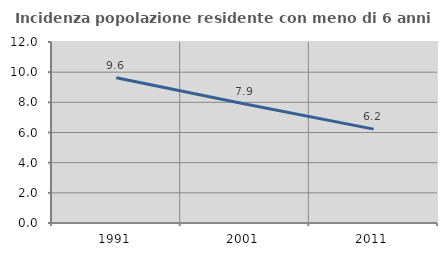
| Category | Incidenza popolazione residente con meno di 6 anni |
|---|---|
| 1991.0 | 9.631 |
| 2001.0 | 7.893 |
| 2011.0 | 6.224 |